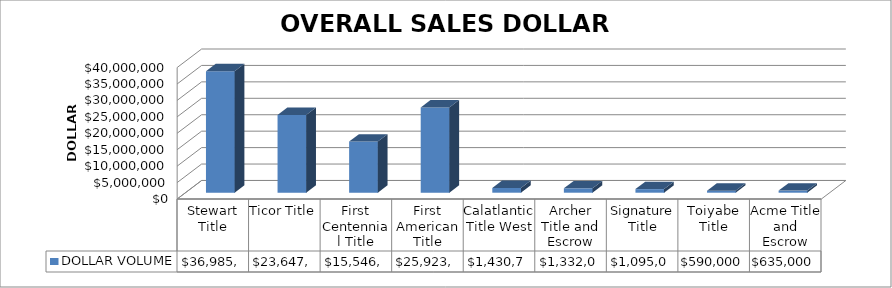
| Category | DOLLAR VOLUME |
|---|---|
| Stewart Title | 36985934.13 |
| Ticor Title | 23647519 |
| First Centennial Title | 15546475.8 |
| First American Title | 25923179 |
| Calatlantic Title West | 1430765 |
| Archer Title and Escrow | 1332000 |
| Signature Title | 1095000 |
| Toiyabe Title | 590000 |
| Acme Title and Escrow | 635000 |